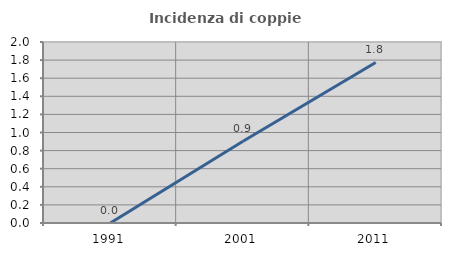
| Category | Incidenza di coppie miste |
|---|---|
| 1991.0 | 0 |
| 2001.0 | 0.903 |
| 2011.0 | 1.774 |